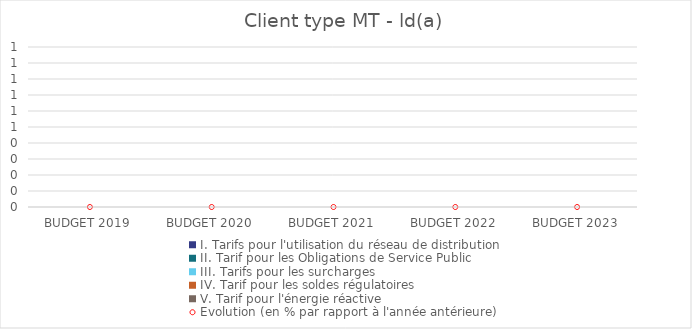
| Category | I. Tarifs pour l'utilisation du réseau de distribution | II. Tarif pour les Obligations de Service Public  | III. Tarifs pour les surcharges   | IV. Tarif pour les soldes régulatoires | V. Tarif pour l'énergie réactive |
|---|---|---|---|---|---|
| BUDGET 2019 | 0 | 0 | 0 | 0 | 0 |
| BUDGET 2020 | 0 | 0 | 0 | 0 | 0 |
| BUDGET 2021 | 0 | 0 | 0 | 0 | 0 |
| BUDGET 2022 | 0 | 0 | 0 | 0 | 0 |
| BUDGET 2023 | 0 | 0 | 0 | 0 | 0 |